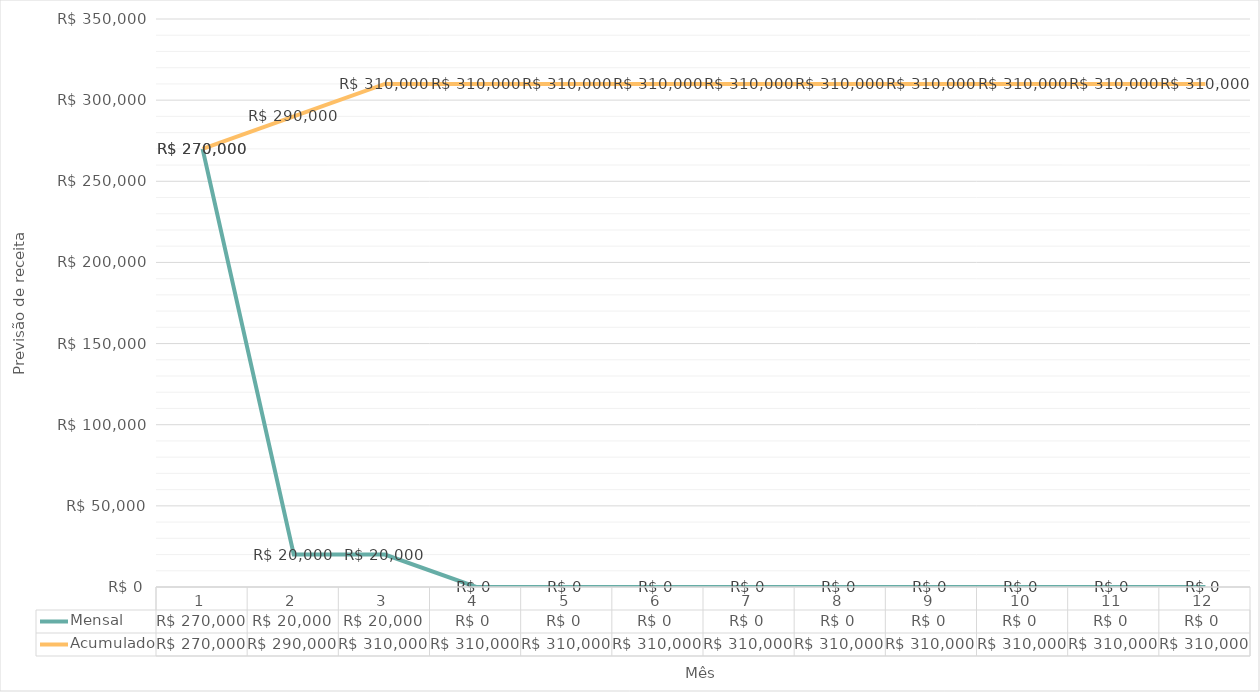
| Category | Mensal | Acumulado |
|---|---|---|
| 0 | 270000 | 270000 |
| 1 | 20000 | 290000 |
| 2 | 20000 | 310000 |
| 3 | 0 | 310000 |
| 4 | 0 | 310000 |
| 5 | 0 | 310000 |
| 6 | 0 | 310000 |
| 7 | 0 | 310000 |
| 8 | 0 | 310000 |
| 9 | 0 | 310000 |
| 10 | 0 | 310000 |
| 11 | 0 | 310000 |